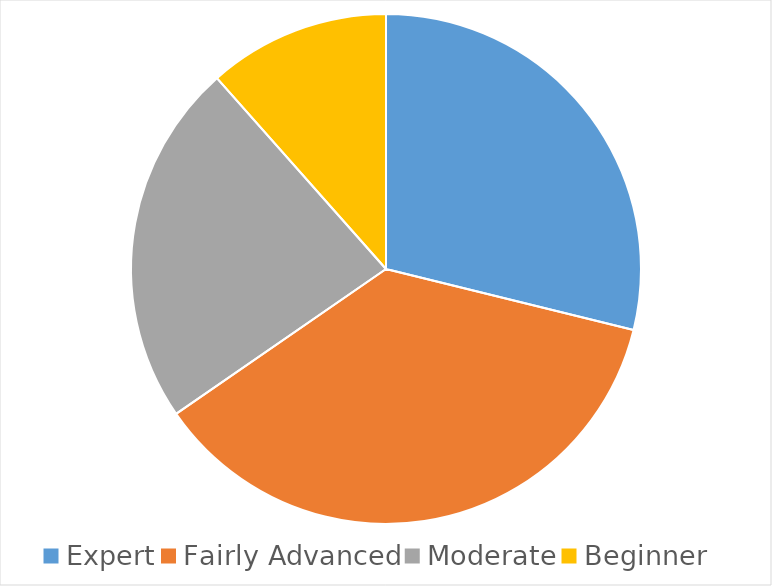
| Category | Series 0 |
|---|---|
| Expert | 15 |
| Fairly Advanced | 19 |
| Moderate | 12 |
| Beginner | 6 |